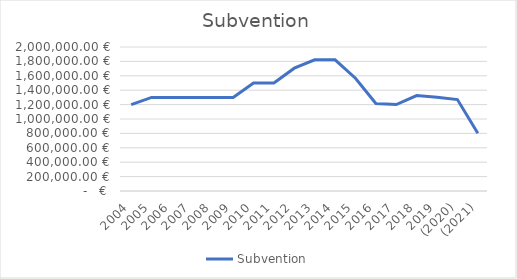
| Category | Subvention |
|---|---|
| 2004 | 1200000 |
| 2005 | 1300000 |
| 2006 | 1300000 |
| 2007 | 1300000 |
| 2008 | 1300000 |
| 2009 | 1300000 |
| 2010 | 1500000 |
| 2011 | 1500000 |
| 2012 | 1705950 |
| 2013 | 1822150 |
| 2014 | 1822150 |
| 2015 | 1566050 |
| 2016 | 1216000 |
| 2017 | 1200000 |
| 2018 | 1325000 |
| 2019 | 1302000 |
| (2020) | 1270000 |
| (2021) | 802000 |